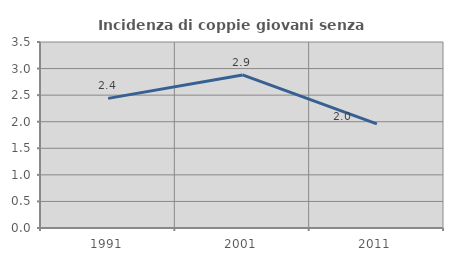
| Category | Incidenza di coppie giovani senza figli |
|---|---|
| 1991.0 | 2.439 |
| 2001.0 | 2.881 |
| 2011.0 | 1.961 |